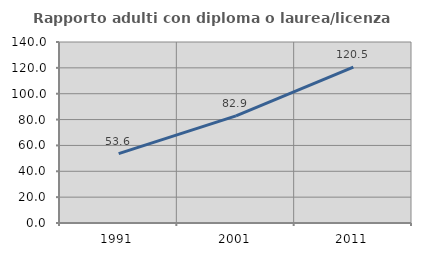
| Category | Rapporto adulti con diploma o laurea/licenza media  |
|---|---|
| 1991.0 | 53.623 |
| 2001.0 | 82.874 |
| 2011.0 | 120.535 |